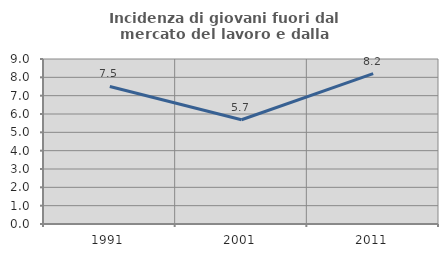
| Category | Incidenza di giovani fuori dal mercato del lavoro e dalla formazione  |
|---|---|
| 1991.0 | 7.504 |
| 2001.0 | 5.687 |
| 2011.0 | 8.199 |